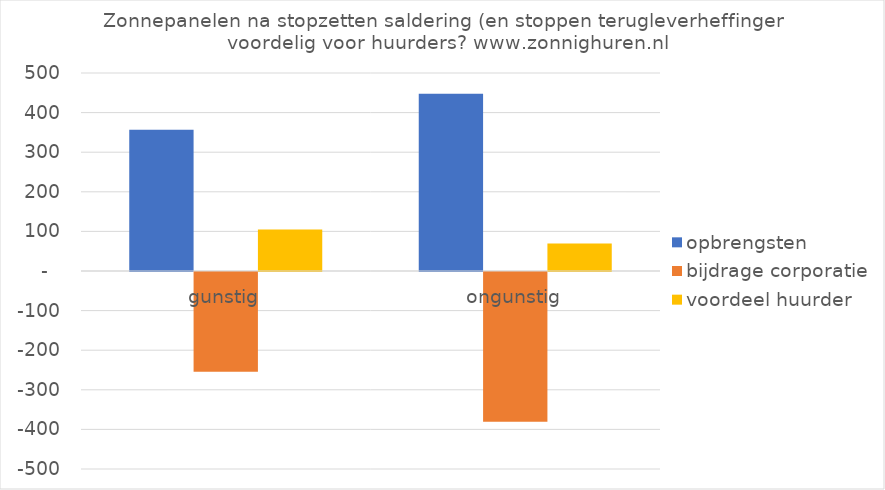
| Category | opbrengsten | bijdrage corporatie | voordeel huurder |
|---|---|---|---|
| gunstig | 357 | -252 | 105 |
| ongunstig | 447.3 | -378 | 69.3 |